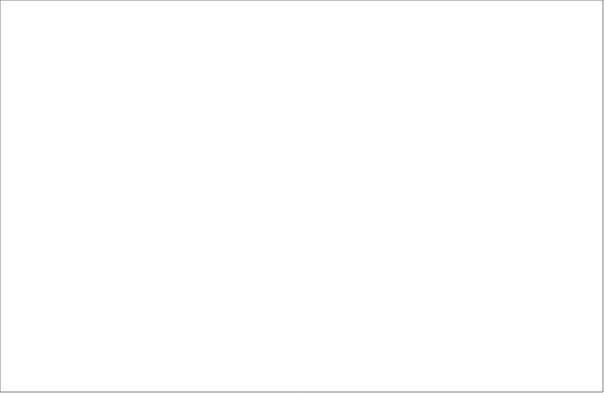
| Category | Series 0 |
|---|---|
| Events publishing: Key details about events can be displayed differently in different contexts, such as the automatic creation of an events calendar. | 19 |
| PURE research data integrations: Introduce more opportunities to present information from the Edinburgh Research Explorer in EdWeb-managed web pages, with no technical knowledge needed. (Currently only publication lists possible). | 12 |
| News publishing: News can be published using a dedicated content type (template); enhancing presentation on different device sizes, allowing more intelligent sharing and promotion in search results. | 11 |
| Content removal: Enable content that is no longer required or created in error to be removable, reducing unnecessary clutter in the EdWeb content tree for editors. | 11 |
| Social media integration: Encourage sharing of website content via social media buttons, and features to monitor engagement on popular networks. | 11 |
| Website design enhancements: Evolution of design to improve website visitor experience on small devices, bringing greater focus to content over brand & navigation elements and promoting clearer/easier interactions. | 9 |
| Integrating external services: Easier integration of services such as Google Maps, You Tube videos, Twitter feeds. Simple URL pasting into EdWeb with no need for interaction with HTML or assets. | 8 |
| Asset search improvements: Searching for images, documents, videos, content snippets etc is quicker, easier and more efficient. | 7 |
| Dashboard enhancements: EdWeb dashboard is more useful to editors and publishers, speeding up completion of the most common tasks, and can be configured to suit an individual's priorities. | 6 |
| Promotional landing pages: A new page type designed for promotional impact and flexibility, which can be used at any point in a site structure. It will work much like a Generic Content page, but have presentational features similar to a homepage. | 6 |
| Search engine redirects: When content is moved or removed, enable 301 redirects. This reduces the risk of a website visitor receiving a 'Page not found' error from a search result in the period before the site is re-indexed. | 6 |
| Degree programme content reuse: A means to re-use and extend golden copy content about degree programmes, that is currently published only via the Degree Finder | 6 |
| Easier text editing: The rich text editor is improved, so that it's quicker and easier to make changes to content, to apply stand-out formatting elements and to ensure everything is standards compliant. | 5 |
| Automated content removal and archiving: Schedule archiving and permanent removal of unpublished content after given periods to reduce unnecessary clutter and support compliance with records management legislation. | 5 |
| Overview page flexibility enhancements: Introduce new layout options to enable overview pages to dynamically present the content below in a range of ways. | 4 |
| Self-help content template: A content type (template) optimised for presentation of online help and guidance, supporting user self service. | 4 |
| Blog publishing: Blogs can be published via EdWeb, with sufficient design changes to distinguish from corporate web content, and new navigation and filtering options typically associated with this kind of content (sort by author, by date, by tag etc). | 3 |
| Granularity of editorial permissions: Editing rights can be restricted to particular subsections or content types, rather than having access to everything in a particular site. | 2 |
| Visitor feedback collection: Editors can collect and view visitor ratings for page content, to identify strengths and quickly correct any errors. | 2 |
| Enhanced website interaction monitoring: Enable use of analytics tools (click heat tracking, A/B testing etc) that provide additional insight into how website visitors are interacting with the website. This informs ongoing content & design improvements. | 2 |
| Dotmailer integration: Enable use of Dotmailer through EdWeb as a means to build and manage mailing lists more efficiently. | 2 |
| Integrated content speed improvements: Speed up page load times for content being delivered from external systems through EdWeb. | 2 |
| Editorial permissions management: Lead publishers can assign editorial rights on their website to any trained user, without involving EdWeb support. | 1 |
| Copyright/OER promotion: Images, documents and other assets can be promoted as Open Educational Resources, encouraging reuse of University materials worldwide. | 1 |
| Tracking link references: Every page will contain a list of all other EdWeb pages that link to it, so that when it is edited, moved or removed the editor is aware of the impact of their actions on other publishers across the University. | 1 |
| Organisation & service profiles: Profiles can be published using a dedicated content type (template); enhancing presentation on different device sizes, allowing more intelligent sharing and promotion in search results. | 1 |
| Usage monitoring: Website managers and EdWeb support services have access to data on editorial and publishing activity, which will support better website management, staffing and user support-related decision making. | 0 |